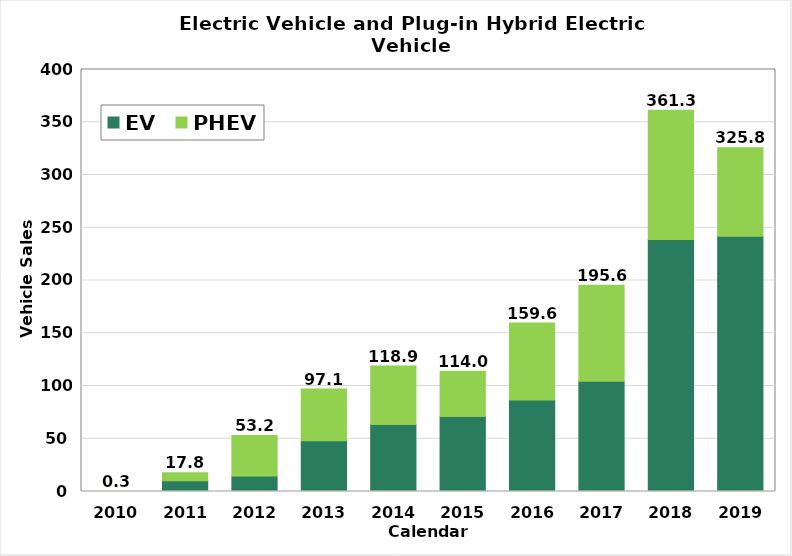
| Category | EV  | PHEV | Total |
|---|---|---|---|
| 2010.0 | 0.019 | 0.326 | 0.345 |
| 2011.0 | 10.092 | 7.671 | 17.763 |
| 2012.0 | 14.587 | 38.584 | 53.171 |
| 2013.0 | 48.094 | 49.008 | 97.102 |
| 2014.0 | 63.525 | 55.357 | 118.882 |
| 2015.0 | 71.064 | 42.959 | 114.023 |
| 2016.0 | 86.731 | 72.885 | 159.616 |
| 2017.0 | 104.492 | 91.089 | 195.581 |
| 2018.0 | 238.823 | 122.492 | 361.315 |
| 2019.0 | 242.03 | 83.809 | 325.839 |